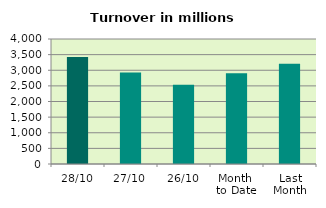
| Category | Series 0 |
|---|---|
| 28/10 | 3421.393 |
| 27/10 | 2926.221 |
| 26/10 | 2535.045 |
| Month 
to Date | 2900.08 |
| Last
Month | 3204.516 |